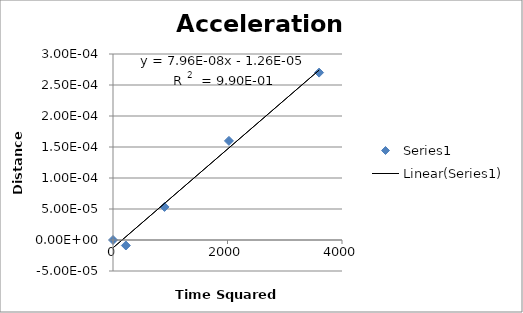
| Category | Series 0 |
|---|---|
| 0.0 | 0 |
| 225.0 | 0 |
| 900.0 | 0 |
| 2025.0 | 0 |
| 3600.0 | 0 |